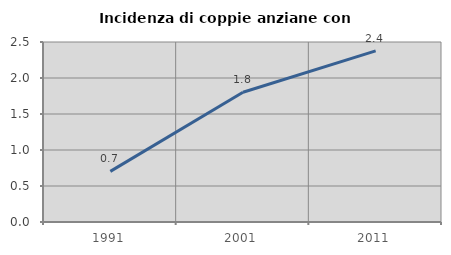
| Category | Incidenza di coppie anziane con figli |
|---|---|
| 1991.0 | 0.704 |
| 2001.0 | 1.802 |
| 2011.0 | 2.377 |